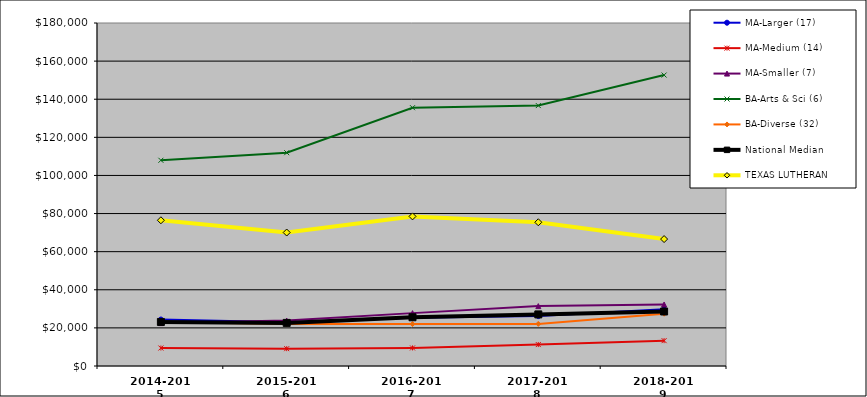
| Category | MA-Larger (17) | MA-Medium (14) | MA-Smaller (7) | BA-Arts & Sci (6) | BA-Diverse (32) | National Median |  TEXAS LUTHERAN  |
|---|---|---|---|---|---|---|---|
| 2014-2015 | 24396.025 | 9433.065 | 22514.23 | 107963.086 | 23117.708 | 23117.708 | 76478.341 |
| 2015-2016 | 22894.173 | 9096.924 | 23847.797 | 111934.231 | 22032.583 | 22619.893 | 70047.888 |
| 2016-2017 | 25378.37 | 9480.281 | 27747.288 | 135553.36 | 22003.31 | 25581.053 | 78508.712 |
| 2017-2018 | 26178.662 | 11246.972 | 31425.244 | 136669.57 | 22105.417 | 27067.87 | 75423 |
| 2018-2019 | 29738.293 | 13291.929 | 32288.488 | 152680.22 | 27445.83 | 28604.166 | 66606.85 |